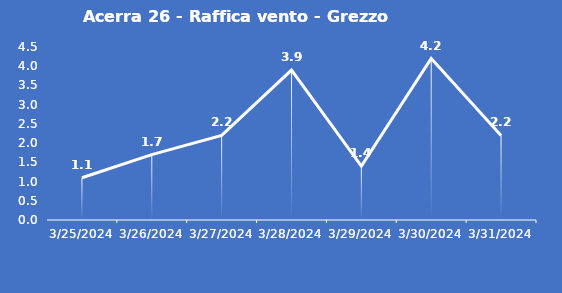
| Category | Acerra 26 - Raffica vento - Grezzo (m/s) |
|---|---|
| 3/25/24 | 1.1 |
| 3/26/24 | 1.7 |
| 3/27/24 | 2.2 |
| 3/28/24 | 3.9 |
| 3/29/24 | 1.4 |
| 3/30/24 | 4.2 |
| 3/31/24 | 2.2 |